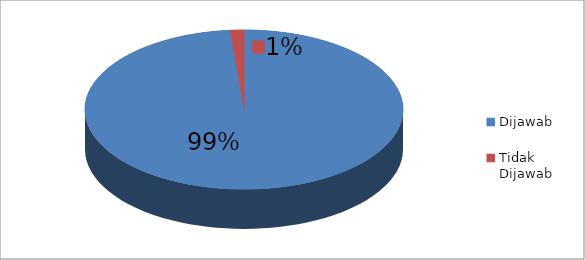
| Category | Series 0 |
|---|---|
| Dijawab | 70 |
| Tidak Dijawab | 1 |